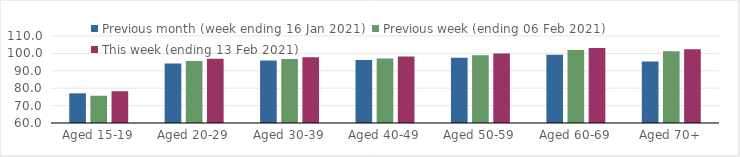
| Category | Previous month (week ending 16 Jan 2021) | Previous week (ending 06 Feb 2021) | This week (ending 13 Feb 2021) |
|---|---|---|---|
| Aged 15-19 | 77.05 | 75.68 | 78.25 |
| Aged 20-29 | 94.19 | 95.61 | 96.88 |
| Aged 30-39 | 95.97 | 96.75 | 97.73 |
| Aged 40-49 | 96.23 | 97.13 | 98.17 |
| Aged 50-59 | 97.56 | 98.98 | 99.96 |
| Aged 60-69 | 99.27 | 101.96 | 103.06 |
| Aged 70+ | 95.33 | 101.18 | 102.4 |